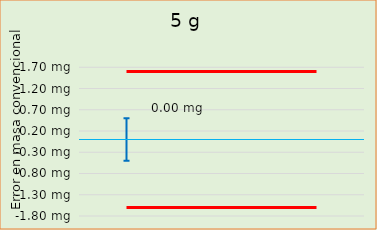
| Category | Error en masa convencional  |  ± EMP |
|---|---|---|
| 0 |  | -1.6 |
| 1 |  | -1.6 |
| 2 |  | -1.6 |